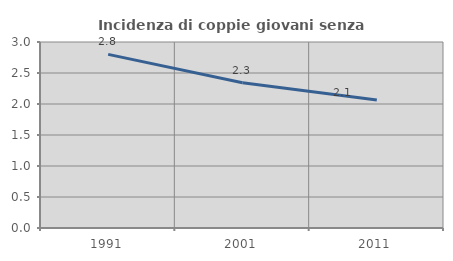
| Category | Incidenza di coppie giovani senza figli |
|---|---|
| 1991.0 | 2.8 |
| 2001.0 | 2.344 |
| 2011.0 | 2.066 |